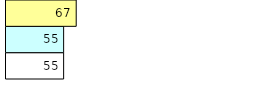
| Category | Total Standouts | Total Recd | Total Tipsters |
|---|---|---|---|
| 0 | 55 | 55 | 67 |